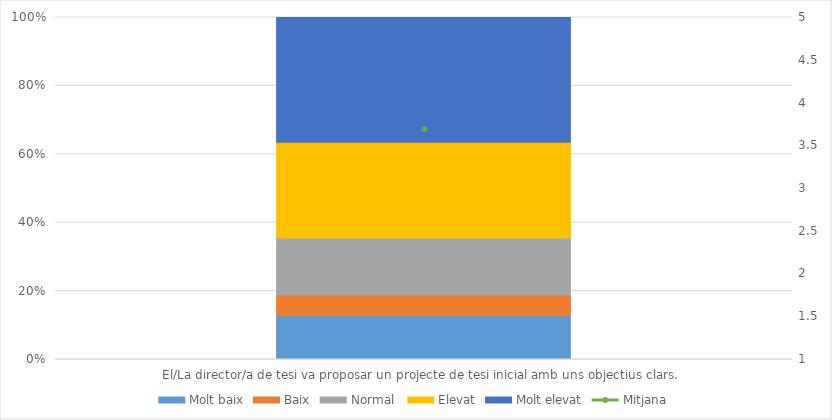
| Category | Molt baix | Baix | Normal  | Elevat | Molt elevat |
|---|---|---|---|---|---|
| El/La director/a de tesi va proposar un projecte de tesi inicial amb uns objectius clars.  | 41 | 19 | 53 | 89 | 116 |